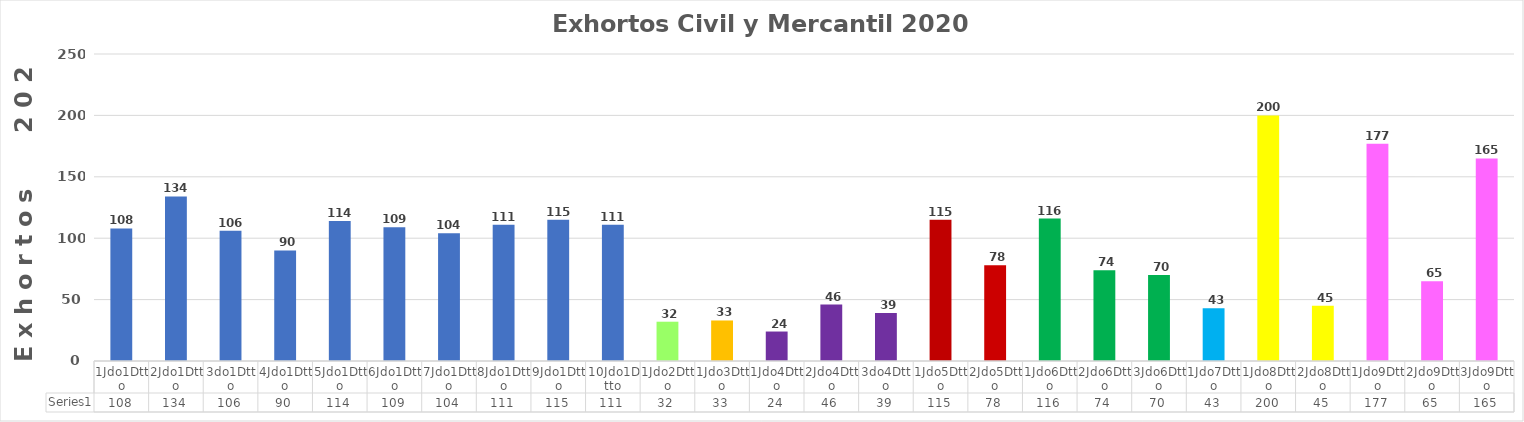
| Category | Series 0 |
|---|---|
| 1Jdo1Dtto | 108 |
| 2Jdo1Dtto | 134 |
| 3do1Dtto | 106 |
| 4Jdo1Dtto | 90 |
| 5Jdo1Dtto | 114 |
| 6Jdo1Dtto | 109 |
| 7Jdo1Dtto | 104 |
| 8Jdo1Dtto | 111 |
| 9Jdo1Dtto | 115 |
| 10Jdo1Dtto | 111 |
| 1Jdo2Dtto | 32 |
| 1Jdo3Dtto | 33 |
| 1Jdo4Dtto | 24 |
| 2Jdo4Dtto | 46 |
| 3do4Dtto | 39 |
| 1Jdo5Dtto | 115 |
| 2Jdo5Dtto | 78 |
| 1Jdo6Dtto | 116 |
| 2Jdo6Dtto | 74 |
| 3Jdo6Dtto | 70 |
| 1Jdo7Dtto | 43 |
| 1Jdo8Dtto | 200 |
| 2Jdo8Dtto | 45 |
| 1Jdo9Dtto | 177 |
| 2Jdo9Dtto | 65 |
| 3Jdo9Dtto | 165 |